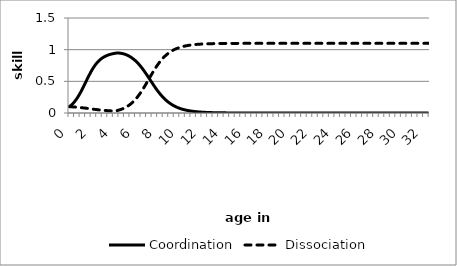
| Category | Coordination | Dissociation |
|---|---|---|
| 0.0 | 0.1 | 0.1 |
| 0.08333333333333333 | 0.112 | 0.099 |
| 0.16666666666666666 | 0.124 | 0.098 |
| 0.25 | 0.138 | 0.097 |
| 0.3333333333333333 | 0.153 | 0.096 |
| 0.4166666666666667 | 0.17 | 0.095 |
| 0.5 | 0.188 | 0.094 |
| 0.5833333333333334 | 0.207 | 0.093 |
| 0.6666666666666666 | 0.228 | 0.091 |
| 0.75 | 0.25 | 0.09 |
| 0.8333333333333334 | 0.274 | 0.089 |
| 0.9166666666666666 | 0.299 | 0.087 |
| 1.0 | 0.325 | 0.086 |
| 1.0833333333333333 | 0.352 | 0.084 |
| 1.1666666666666667 | 0.38 | 0.083 |
| 1.25 | 0.409 | 0.081 |
| 1.3333333333333333 | 0.439 | 0.079 |
| 1.4166666666666667 | 0.469 | 0.077 |
| 1.5 | 0.499 | 0.075 |
| 1.5833333333333333 | 0.529 | 0.074 |
| 1.6666666666666667 | 0.559 | 0.072 |
| 1.75 | 0.588 | 0.07 |
| 1.8333333333333333 | 0.616 | 0.068 |
| 1.9166666666666667 | 0.643 | 0.066 |
| 2.0 | 0.669 | 0.064 |
| 2.0833333333333335 | 0.694 | 0.062 |
| 2.1666666666666665 | 0.717 | 0.06 |
| 2.25 | 0.739 | 0.058 |
| 2.3333333333333335 | 0.759 | 0.056 |
| 2.4166666666666665 | 0.778 | 0.054 |
| 2.5 | 0.796 | 0.053 |
| 2.5833333333333335 | 0.812 | 0.051 |
| 2.6666666666666665 | 0.826 | 0.049 |
| 2.75 | 0.84 | 0.048 |
| 2.8333333333333335 | 0.852 | 0.046 |
| 2.9166666666666665 | 0.863 | 0.045 |
| 3.0 | 0.873 | 0.043 |
| 3.0833333333333335 | 0.882 | 0.042 |
| 3.1666666666666665 | 0.89 | 0.041 |
| 3.25 | 0.898 | 0.04 |
| 3.3333333333333335 | 0.904 | 0.038 |
| 3.4166666666666665 | 0.91 | 0.037 |
| 3.5 | 0.916 | 0.036 |
| 3.5833333333333335 | 0.921 | 0.035 |
| 3.6666666666666665 | 0.925 | 0.034 |
| 3.75 | 0.929 | 0.033 |
| 3.8333333333333335 | 0.933 | 0.032 |
| 3.9166666666666665 | 0.936 | 0.032 |
| 4.0 | 0.939 | 0.031 |
| 4.083333333333333 | 0.942 | 0.03 |
| 4.166666666666667 | 0.945 | 0.033 |
| 4.25 | 0.946 | 0.036 |
| 4.333333333333333 | 0.947 | 0.04 |
| 4.416666666666667 | 0.947 | 0.044 |
| 4.5 | 0.946 | 0.048 |
| 4.583333333333333 | 0.945 | 0.053 |
| 4.666666666666667 | 0.943 | 0.058 |
| 4.75 | 0.94 | 0.063 |
| 4.833333333333333 | 0.936 | 0.069 |
| 4.916666666666667 | 0.932 | 0.076 |
| 5.0 | 0.928 | 0.083 |
| 5.083333333333333 | 0.922 | 0.091 |
| 5.166666666666667 | 0.916 | 0.099 |
| 5.25 | 0.91 | 0.108 |
| 5.333333333333333 | 0.902 | 0.117 |
| 5.416666666666667 | 0.894 | 0.128 |
| 5.5 | 0.886 | 0.139 |
| 5.583333333333333 | 0.876 | 0.151 |
| 5.666666666666667 | 0.866 | 0.164 |
| 5.75 | 0.855 | 0.177 |
| 5.833333333333333 | 0.843 | 0.192 |
| 5.916666666666667 | 0.831 | 0.207 |
| 6.0 | 0.817 | 0.224 |
| 6.083333333333333 | 0.803 | 0.241 |
| 6.166666666666667 | 0.788 | 0.26 |
| 6.25 | 0.772 | 0.279 |
| 6.333333333333333 | 0.756 | 0.299 |
| 6.416666666666667 | 0.738 | 0.32 |
| 6.5 | 0.72 | 0.342 |
| 6.583333333333333 | 0.701 | 0.364 |
| 6.666666666666667 | 0.681 | 0.387 |
| 6.75 | 0.661 | 0.411 |
| 6.833333333333333 | 0.64 | 0.435 |
| 6.916666666666667 | 0.619 | 0.46 |
| 7.0 | 0.598 | 0.485 |
| 7.083333333333333 | 0.576 | 0.51 |
| 7.166666666666667 | 0.554 | 0.536 |
| 7.25 | 0.531 | 0.561 |
| 7.333333333333333 | 0.509 | 0.586 |
| 7.416666666666667 | 0.487 | 0.611 |
| 7.5 | 0.465 | 0.636 |
| 7.583333333333333 | 0.443 | 0.66 |
| 7.666666666666667 | 0.422 | 0.683 |
| 7.75 | 0.401 | 0.706 |
| 7.833333333333333 | 0.38 | 0.729 |
| 7.916666666666667 | 0.36 | 0.75 |
| 8.0 | 0.341 | 0.771 |
| 8.083333333333334 | 0.322 | 0.791 |
| 8.166666666666666 | 0.304 | 0.81 |
| 8.25 | 0.286 | 0.828 |
| 8.333333333333334 | 0.269 | 0.845 |
| 8.416666666666666 | 0.253 | 0.862 |
| 8.5 | 0.238 | 0.877 |
| 8.583333333333334 | 0.224 | 0.892 |
| 8.666666666666666 | 0.21 | 0.906 |
| 8.75 | 0.197 | 0.919 |
| 8.833333333333334 | 0.184 | 0.931 |
| 8.916666666666666 | 0.172 | 0.942 |
| 9.0 | 0.161 | 0.953 |
| 9.083333333333334 | 0.151 | 0.963 |
| 9.166666666666666 | 0.141 | 0.973 |
| 9.25 | 0.132 | 0.981 |
| 9.333333333333334 | 0.123 | 0.99 |
| 9.416666666666666 | 0.115 | 0.997 |
| 9.5 | 0.107 | 1.004 |
| 9.583333333333334 | 0.1 | 1.011 |
| 9.666666666666666 | 0.093 | 1.017 |
| 9.75 | 0.087 | 1.023 |
| 9.833333333333334 | 0.081 | 1.029 |
| 9.916666666666666 | 0.076 | 1.034 |
| 10.0 | 0.07 | 1.038 |
| 10.083333333333334 | 0.066 | 1.043 |
| 10.166666666666666 | 0.061 | 1.047 |
| 10.25 | 0.057 | 1.05 |
| 10.333333333333334 | 0.053 | 1.054 |
| 10.416666666666666 | 0.049 | 1.057 |
| 10.5 | 0.046 | 1.06 |
| 10.583333333333334 | 0.043 | 1.063 |
| 10.666666666666666 | 0.04 | 1.066 |
| 10.75 | 0.037 | 1.068 |
| 10.833333333333334 | 0.035 | 1.07 |
| 10.916666666666666 | 0.032 | 1.072 |
| 11.0 | 0.03 | 1.074 |
| 11.083333333333334 | 0.028 | 1.076 |
| 11.166666666666666 | 0.026 | 1.078 |
| 11.25 | 0.024 | 1.079 |
| 11.333333333333334 | 0.022 | 1.081 |
| 11.416666666666666 | 0.021 | 1.082 |
| 11.5 | 0.019 | 1.083 |
| 11.583333333333334 | 0.018 | 1.085 |
| 11.666666666666666 | 0.017 | 1.086 |
| 11.75 | 0.016 | 1.087 |
| 11.833333333333334 | 0.015 | 1.088 |
| 11.916666666666666 | 0.014 | 1.088 |
| 12.0 | 0.013 | 1.089 |
| 12.083333333333334 | 0.012 | 1.09 |
| 12.166666666666666 | 0.011 | 1.091 |
| 12.25 | 0.01 | 1.091 |
| 12.333333333333334 | 0.009 | 1.092 |
| 12.416666666666666 | 0.009 | 1.093 |
| 12.5 | 0.008 | 1.093 |
| 12.583333333333334 | 0.008 | 1.094 |
| 12.666666666666666 | 0.007 | 1.094 |
| 12.75 | 0.007 | 1.094 |
| 12.833333333333334 | 0.006 | 1.095 |
| 12.916666666666666 | 0.006 | 1.095 |
| 13.0 | 0.005 | 1.096 |
| 13.083333333333334 | 0.005 | 1.096 |
| 13.166666666666666 | 0.005 | 1.096 |
| 13.25 | 0.004 | 1.096 |
| 13.333333333333334 | 0.004 | 1.097 |
| 13.416666666666666 | 0.004 | 1.097 |
| 13.5 | 0.003 | 1.097 |
| 13.583333333333334 | 0.003 | 1.097 |
| 13.666666666666666 | 0.003 | 1.097 |
| 13.75 | 0.003 | 1.098 |
| 13.833333333333334 | 0.003 | 1.098 |
| 13.916666666666666 | 0.002 | 1.098 |
| 14.0 | 0.002 | 1.098 |
| 14.083333333333334 | 0.002 | 1.098 |
| 14.166666666666666 | 0.002 | 1.098 |
| 14.25 | 0.002 | 1.098 |
| 14.333333333333334 | 0.002 | 1.099 |
| 14.416666666666666 | 0.002 | 1.099 |
| 14.5 | 0.001 | 1.099 |
| 14.583333333333334 | 0.001 | 1.099 |
| 14.666666666666666 | 0.001 | 1.099 |
| 14.75 | 0.001 | 1.099 |
| 14.833333333333334 | 0.001 | 1.099 |
| 14.916666666666666 | 0.001 | 1.099 |
| 15.0 | 0.001 | 1.099 |
| 15.083333333333334 | 0.001 | 1.099 |
| 15.166666666666666 | 0.001 | 1.099 |
| 15.25 | 0.001 | 1.099 |
| 15.333333333333334 | 0.001 | 1.099 |
| 15.416666666666666 | 0.001 | 1.099 |
| 15.5 | 0.001 | 1.099 |
| 15.583333333333334 | 0.001 | 1.1 |
| 15.666666666666666 | 0.001 | 1.1 |
| 15.75 | 0 | 1.1 |
| 15.833333333333334 | 0 | 1.1 |
| 15.916666666666666 | 0 | 1.1 |
| 16.0 | 0 | 1.1 |
| 16.083333333333332 | 0 | 1.1 |
| 16.166666666666668 | 0 | 1.1 |
| 16.25 | 0 | 1.1 |
| 16.333333333333332 | 0 | 1.1 |
| 16.416666666666668 | 0 | 1.1 |
| 16.5 | 0 | 1.1 |
| 16.583333333333332 | 0 | 1.1 |
| 16.666666666666668 | 0 | 1.1 |
| 16.75 | 0 | 1.1 |
| 16.833333333333332 | 0 | 1.1 |
| 16.916666666666668 | 0 | 1.1 |
| 17.0 | 0 | 1.1 |
| 17.083333333333332 | 0 | 1.1 |
| 17.166666666666668 | 0 | 1.1 |
| 17.25 | 0 | 1.1 |
| 17.333333333333332 | 0 | 1.1 |
| 17.416666666666668 | 0 | 1.1 |
| 17.5 | 0 | 1.1 |
| 17.583333333333332 | 0 | 1.1 |
| 17.666666666666668 | 0 | 1.1 |
| 17.75 | 0 | 1.1 |
| 17.833333333333332 | 0 | 1.1 |
| 17.916666666666668 | 0 | 1.1 |
| 18.0 | 0 | 1.1 |
| 18.083333333333332 | 0 | 1.1 |
| 18.166666666666668 | 0 | 1.1 |
| 18.25 | 0 | 1.1 |
| 18.333333333333332 | 0 | 1.1 |
| 18.416666666666668 | 0 | 1.1 |
| 18.5 | 0 | 1.1 |
| 18.583333333333332 | 0 | 1.1 |
| 18.666666666666668 | 0 | 1.1 |
| 18.75 | 0 | 1.1 |
| 18.833333333333332 | 0 | 1.1 |
| 18.916666666666668 | 0 | 1.1 |
| 19.0 | 0 | 1.1 |
| 19.083333333333332 | 0 | 1.1 |
| 19.166666666666668 | 0 | 1.1 |
| 19.25 | 0 | 1.1 |
| 19.333333333333332 | 0 | 1.1 |
| 19.416666666666668 | 0 | 1.1 |
| 19.5 | 0 | 1.1 |
| 19.583333333333332 | 0 | 1.1 |
| 19.666666666666668 | 0 | 1.1 |
| 19.75 | 0 | 1.1 |
| 19.833333333333332 | 0 | 1.1 |
| 19.916666666666668 | 0 | 1.1 |
| 20.0 | 0 | 1.1 |
| 20.083333333333332 | 0 | 1.1 |
| 20.166666666666668 | 0 | 1.1 |
| 20.25 | 0 | 1.1 |
| 20.333333333333332 | 0 | 1.1 |
| 20.416666666666668 | 0 | 1.1 |
| 20.5 | 0 | 1.1 |
| 20.583333333333332 | 0 | 1.1 |
| 20.666666666666668 | 0 | 1.1 |
| 20.75 | 0 | 1.1 |
| 20.833333333333332 | 0 | 1.1 |
| 20.916666666666668 | 0 | 1.1 |
| 21.0 | 0 | 1.1 |
| 21.083333333333332 | 0 | 1.1 |
| 21.166666666666668 | 0 | 1.1 |
| 21.25 | 0 | 1.1 |
| 21.333333333333332 | 0 | 1.1 |
| 21.416666666666668 | 0 | 1.1 |
| 21.5 | 0 | 1.1 |
| 21.583333333333332 | 0 | 1.1 |
| 21.666666666666668 | 0 | 1.1 |
| 21.75 | 0 | 1.1 |
| 21.833333333333332 | 0 | 1.1 |
| 21.916666666666668 | 0 | 1.1 |
| 22.0 | 0 | 1.1 |
| 22.083333333333332 | 0 | 1.1 |
| 22.166666666666668 | 0 | 1.1 |
| 22.25 | 0 | 1.1 |
| 22.333333333333332 | 0 | 1.1 |
| 22.416666666666668 | 0 | 1.1 |
| 22.5 | 0 | 1.1 |
| 22.583333333333332 | 0 | 1.1 |
| 22.666666666666668 | 0 | 1.1 |
| 22.75 | 0 | 1.1 |
| 22.833333333333332 | 0 | 1.1 |
| 22.916666666666668 | 0 | 1.1 |
| 23.0 | 0 | 1.1 |
| 23.083333333333332 | 0 | 1.1 |
| 23.166666666666668 | 0 | 1.1 |
| 23.25 | 0 | 1.1 |
| 23.333333333333332 | 0 | 1.1 |
| 23.416666666666668 | 0 | 1.1 |
| 23.5 | 0 | 1.1 |
| 23.583333333333332 | 0 | 1.1 |
| 23.666666666666668 | 0 | 1.1 |
| 23.75 | 0 | 1.1 |
| 23.833333333333332 | 0 | 1.1 |
| 23.916666666666668 | 0 | 1.1 |
| 24.0 | 0 | 1.1 |
| 24.083333333333332 | 0 | 1.1 |
| 24.166666666666668 | 0 | 1.1 |
| 24.25 | 0 | 1.1 |
| 24.333333333333332 | 0 | 1.1 |
| 24.416666666666668 | 0 | 1.1 |
| 24.5 | 0 | 1.1 |
| 24.583333333333332 | 0 | 1.1 |
| 24.666666666666668 | 0 | 1.1 |
| 24.75 | 0 | 1.1 |
| 24.833333333333332 | 0 | 1.1 |
| 24.916666666666668 | 0 | 1.1 |
| 25.0 | 0 | 1.1 |
| 25.083333333333332 | 0 | 1.1 |
| 25.166666666666668 | 0 | 1.1 |
| 25.25 | 0 | 1.1 |
| 25.333333333333332 | 0 | 1.1 |
| 25.416666666666668 | 0 | 1.1 |
| 25.5 | 0 | 1.1 |
| 25.583333333333332 | 0 | 1.1 |
| 25.666666666666668 | 0 | 1.1 |
| 25.75 | 0 | 1.1 |
| 25.833333333333332 | 0 | 1.1 |
| 25.916666666666668 | 0 | 1.1 |
| 26.0 | 0 | 1.1 |
| 26.083333333333332 | 0 | 1.1 |
| 26.166666666666668 | 0 | 1.1 |
| 26.25 | 0 | 1.1 |
| 26.333333333333332 | 0 | 1.1 |
| 26.416666666666668 | 0 | 1.1 |
| 26.5 | 0 | 1.1 |
| 26.583333333333332 | 0 | 1.1 |
| 26.666666666666668 | 0 | 1.1 |
| 26.75 | 0 | 1.1 |
| 26.833333333333332 | 0 | 1.1 |
| 26.916666666666668 | 0 | 1.1 |
| 27.0 | 0 | 1.1 |
| 27.083333333333332 | 0 | 1.1 |
| 27.166666666666668 | 0 | 1.1 |
| 27.25 | 0 | 1.1 |
| 27.333333333333332 | 0 | 1.1 |
| 27.416666666666668 | 0 | 1.1 |
| 27.5 | 0 | 1.1 |
| 27.583333333333332 | 0 | 1.1 |
| 27.666666666666668 | 0 | 1.1 |
| 27.75 | 0 | 1.1 |
| 27.833333333333332 | 0 | 1.1 |
| 27.916666666666668 | 0 | 1.1 |
| 28.0 | 0 | 1.1 |
| 28.083333333333332 | 0 | 1.1 |
| 28.166666666666668 | 0 | 1.1 |
| 28.25 | 0 | 1.1 |
| 28.333333333333332 | 0 | 1.1 |
| 28.416666666666668 | 0 | 1.1 |
| 28.5 | 0 | 1.1 |
| 28.583333333333332 | 0 | 1.1 |
| 28.666666666666668 | 0 | 1.1 |
| 28.75 | 0 | 1.1 |
| 28.833333333333332 | 0 | 1.1 |
| 28.916666666666668 | 0 | 1.1 |
| 29.0 | 0 | 1.1 |
| 29.083333333333332 | 0 | 1.1 |
| 29.166666666666668 | 0 | 1.1 |
| 29.25 | 0 | 1.1 |
| 29.333333333333332 | 0 | 1.1 |
| 29.416666666666668 | 0 | 1.1 |
| 29.5 | 0 | 1.1 |
| 29.583333333333332 | 0 | 1.1 |
| 29.666666666666668 | 0 | 1.1 |
| 29.75 | 0 | 1.1 |
| 29.833333333333332 | 0 | 1.1 |
| 29.916666666666668 | 0 | 1.1 |
| 30.0 | 0 | 1.1 |
| 30.083333333333332 | 0 | 1.1 |
| 30.166666666666668 | 0 | 1.1 |
| 30.25 | 0 | 1.1 |
| 30.333333333333332 | 0 | 1.1 |
| 30.416666666666668 | 0 | 1.1 |
| 30.5 | 0 | 1.1 |
| 30.583333333333332 | 0 | 1.1 |
| 30.666666666666668 | 0 | 1.1 |
| 30.75 | 0 | 1.1 |
| 30.833333333333332 | 0 | 1.1 |
| 30.916666666666668 | 0 | 1.1 |
| 31.0 | 0 | 1.1 |
| 31.083333333333332 | 0 | 1.1 |
| 31.166666666666668 | 0 | 1.1 |
| 31.25 | 0 | 1.1 |
| 31.333333333333332 | 0 | 1.1 |
| 31.416666666666668 | 0 | 1.1 |
| 31.5 | 0 | 1.1 |
| 31.583333333333332 | 0 | 1.1 |
| 31.666666666666668 | 0 | 1.1 |
| 31.75 | 0 | 1.1 |
| 31.833333333333332 | 0 | 1.1 |
| 31.916666666666668 | 0 | 1.1 |
| 32.0 | 0 | 1.1 |
| 32.083333333333336 | 0 | 1.1 |
| 32.166666666666664 | 0 | 1.1 |
| 32.25 | 0 | 1.1 |
| 32.333333333333336 | 0 | 1.1 |
| 32.416666666666664 | 0 | 1.1 |
| 32.5 | 0 | 1.1 |